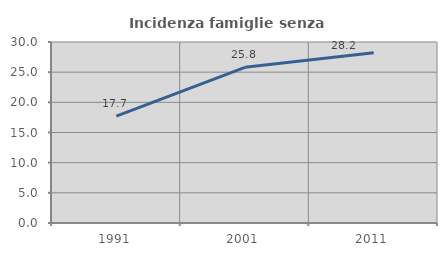
| Category | Incidenza famiglie senza nuclei |
|---|---|
| 1991.0 | 17.717 |
| 2001.0 | 25.802 |
| 2011.0 | 28.223 |